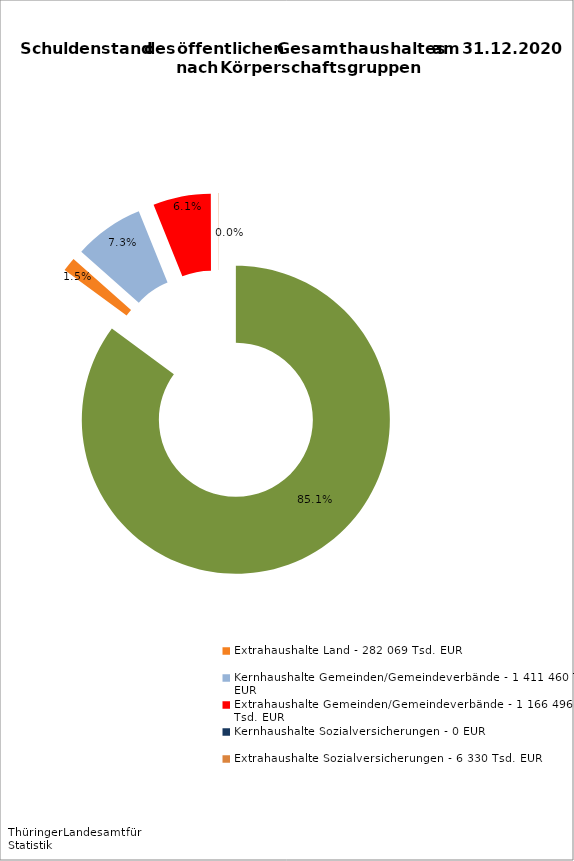
| Category | Series 0 |
|---|---|
| Kernhaushalt Land - 16 374 056 Tsd. EUR | 16374056.299 |
| Extrahaushalte Land - 282 069 Tsd. EUR | 282069.129 |
| Kernhaushalte Gemeinden/Gemeindeverbände - 1 411 460 Tsd. EUR | 1411460.465 |
| Extrahaushalte Gemeinden/Gemeindeverbände - 1 166 496 Tsd. EUR | 1166496.405 |
| Kernhaushalte Sozialversicherungen - 0 EUR | 0 |
| Extrahaushalte Sozialversicherungen - 6 330 Tsd. EUR | 6329.547 |